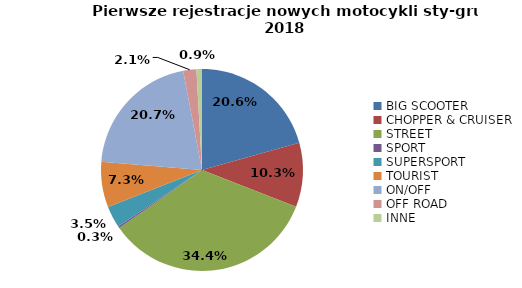
| Category | Series 0 |
|---|---|
| 0 | 3000 |
| 1 | 1491 |
| 2 | 4990 |
| 3 | 43 |
| 4 | 503 |
| 5 | 1056 |
| 6 | 3006 |
| 7 | 307 |
| 8 | 128 |